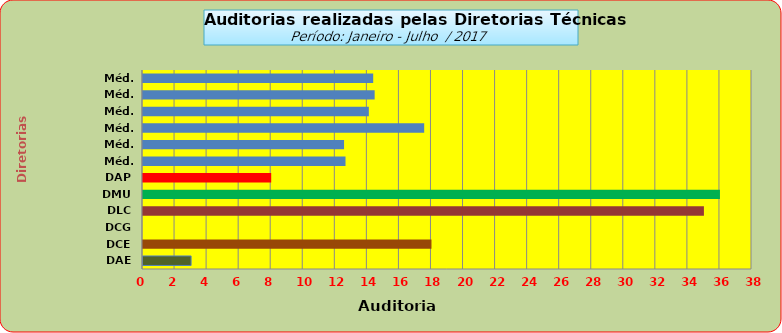
| Category | Series 0 |
|---|---|
| DAE | 3 |
| DCE | 18 |
| DCG | 0 |
| DLC | 35 |
| DMU | 36 |
| DAP | 8 |
| Méd. 2011 | 12.636 |
| Méd. 2012 | 12.545 |
| Méd. 2013 | 17.545 |
| Méd. 2014 | 14.091 |
| Méd. 2015 | 14.455 |
| Méd. 2016 | 14.364 |